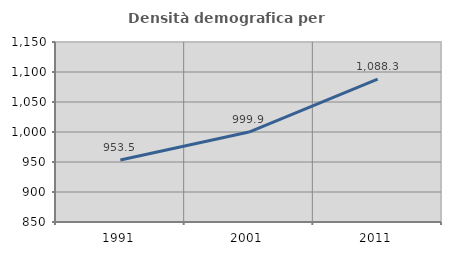
| Category | Densità demografica |
|---|---|
| 1991.0 | 953.465 |
| 2001.0 | 999.931 |
| 2011.0 | 1088.262 |